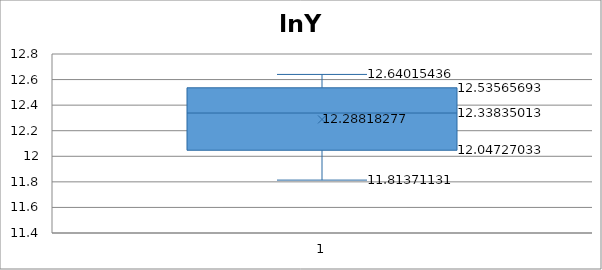
| Category | Residuals |
|---|---|
| 13.126205985121778 | -0.06 |
| 13.162422200783556 | -0.054 |
| 13.202371622945591 | -0.022 |
| 13.238119471312642 | -0.02 |
| 13.275643964524976 | 0.011 |
| 13.313413396762122 | 0.007 |
| 13.33856931905995 | 0.024 |
| 13.369378130872978 | 0.068 |
| 13.409942444551245 | 0.039 |
| 13.45263643878272 | 0.05 |
| 13.498137367850983 | 0.022 |
| 13.548981834160656 | 0.03 |
| 13.605310378635993 | 0.01 |
| 13.665673228916795 | 0.007 |
| 13.72027967501587 | -0.025 |
| 13.762011675159092 | -0.018 |
| 13.803548294531412 | -0.033 |
| 13.859416432434873 | -0.023 |
| 13.910991632256213 | 0.001 |
| 13.956641996933348 | -0.017 |
| 13.983068669430741 | -0.01 |
| 13.997765445869241 | 0 |
| 14.012363520604138 | 0.013 |